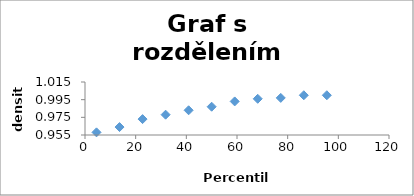
| Category | Series 0 |
|---|---|
| 4.545454545454546 | 0.958 |
| 13.636363636363637 | 0.964 |
| 22.72727272727273 | 0.973 |
| 31.81818181818182 | 0.978 |
| 40.909090909090914 | 0.983 |
| 50.00000000000001 | 0.987 |
| 59.09090909090909 | 0.993 |
| 68.18181818181819 | 0.996 |
| 77.27272727272728 | 0.997 |
| 86.36363636363637 | 1 |
| 95.45454545454547 | 1 |